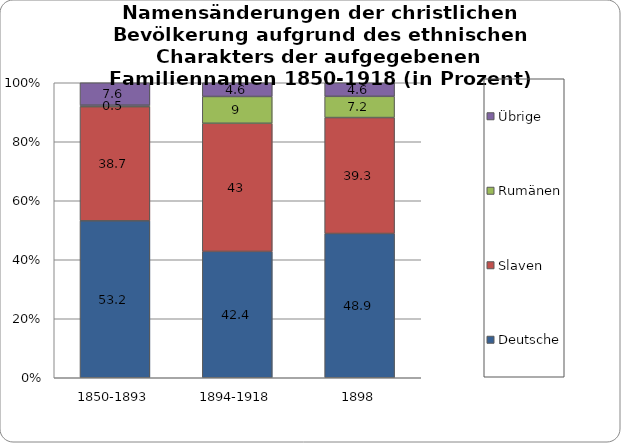
| Category | Deutsche | Slaven | Rumänen | Übrige |
|---|---|---|---|---|
| 1850-1893 | 53.2 | 38.7 | 0.5 | 7.6 |
| 1894-1918 | 42.4 | 43 | 9 | 4.6 |
| 1898 | 48.9 | 39.3 | 7.2 | 4.6 |